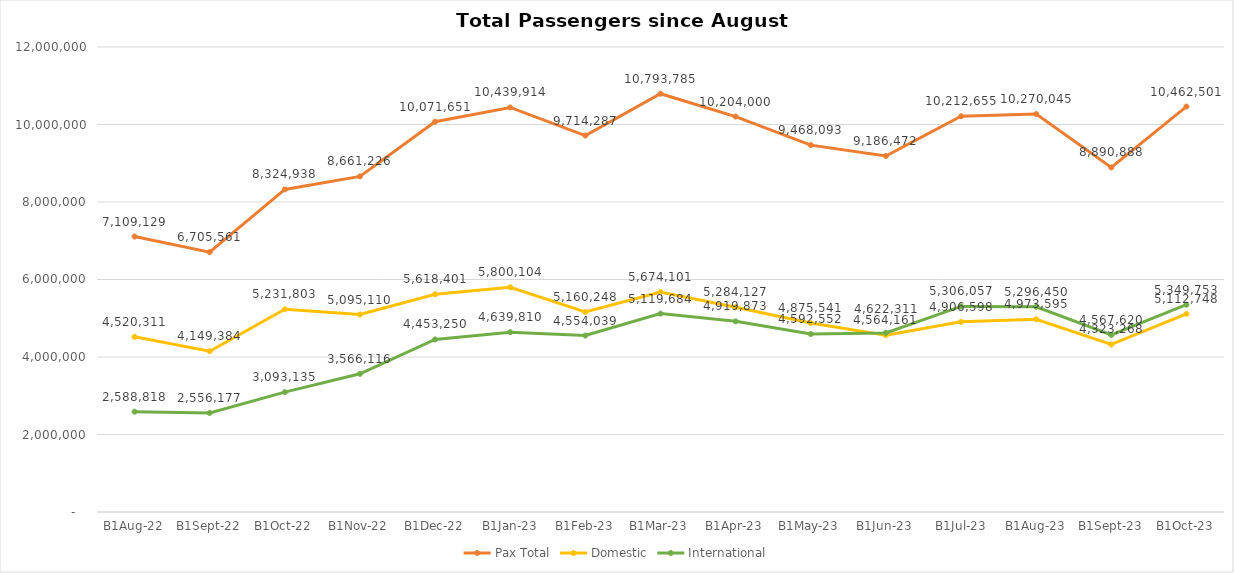
| Category | Pax Total | Domestic | International |
|---|---|---|---|
| 2022-08-01 | 7109129 | 4520311 | 2588818 |
| 2022-09-01 | 6705561 | 4149384 | 2556177 |
| 2022-10-01 | 8324938 | 5231803 | 3093135 |
| 2022-11-01 | 8661226 | 5095110 | 3566116 |
| 2022-12-01 | 10071651 | 5618401 | 4453250 |
| 2023-01-01 | 10439914 | 5800104 | 4639810 |
| 2023-02-01 | 9714287 | 5160248 | 4554039 |
| 2023-03-01 | 10793785 | 5674101 | 5119684 |
| 2023-04-01 | 10204000 | 5284127 | 4919873 |
| 2023-05-01 | 9468093 | 4875541 | 4592552 |
| 2023-06-01 | 9186472 | 4564161 | 4622311 |
| 2023-07-01 | 10212655 | 4906598 | 5306057 |
| 2023-08-01 | 10270045 | 4973595 | 5296450 |
| 2023-09-01 | 8890888 | 4323268 | 4567620 |
| 2023-10-01 | 10462501 | 5112748 | 5349753 |